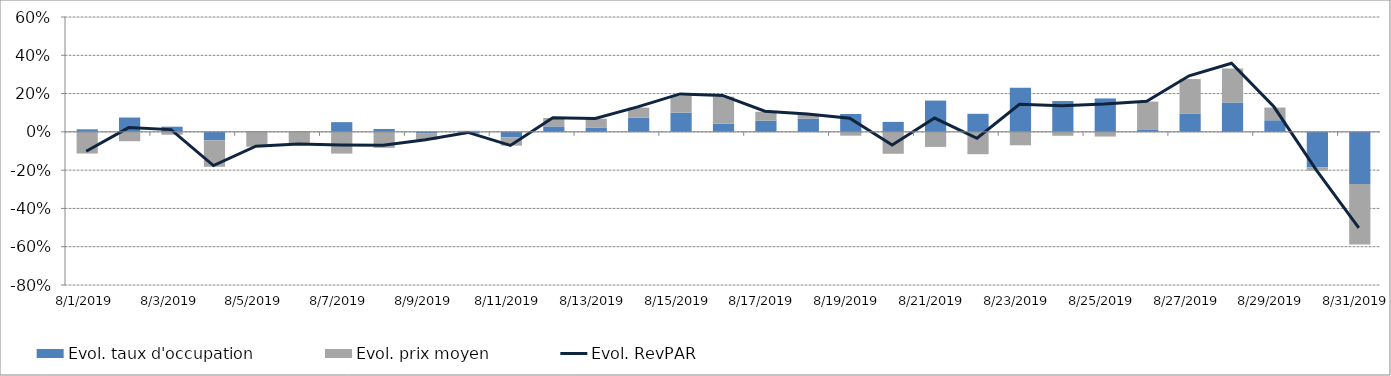
| Category | Evol. taux d'occupation | Evol. prix moyen |
|---|---|---|
| 8/1/19 | 0.013 | -0.113 |
| 8/2/19 | 0.075 | -0.049 |
| 8/3/19 | 0.027 | -0.015 |
| 8/4/19 | -0.045 | -0.138 |
| 8/5/19 | 0.003 | -0.078 |
| 8/6/19 | 0.003 | -0.066 |
| 8/7/19 | 0.051 | -0.114 |
| 8/8/19 | 0.015 | -0.084 |
| 8/9/19 | -0.006 | -0.035 |
| 8/10/19 | -0.009 | 0.006 |
| 8/11/19 | -0.028 | -0.044 |
| 8/12/19 | 0.029 | 0.044 |
| 8/13/19 | 0.023 | 0.046 |
| 8/14/19 | 0.075 | 0.052 |
| 8/15/19 | 0.1 | 0.089 |
| 8/16/19 | 0.043 | 0.141 |
| 8/17/19 | 0.059 | 0.046 |
| 8/18/19 | 0.069 | 0.023 |
| 8/19/19 | 0.093 | -0.02 |
| 8/20/19 | 0.052 | -0.115 |
| 8/21/19 | 0.163 | -0.078 |
| 8/22/19 | 0.094 | -0.117 |
| 8/23/19 | 0.23 | -0.07 |
| 8/24/19 | 0.161 | -0.021 |
| 8/25/19 | 0.174 | -0.025 |
| 8/26/19 | 0.01 | 0.148 |
| 8/27/19 | 0.096 | 0.18 |
| 8/28/19 | 0.153 | 0.178 |
| 8/29/19 | 0.061 | 0.066 |
| 8/30/19 | -0.186 | -0.018 |
| 8/31/19 | -0.272 | -0.316 |